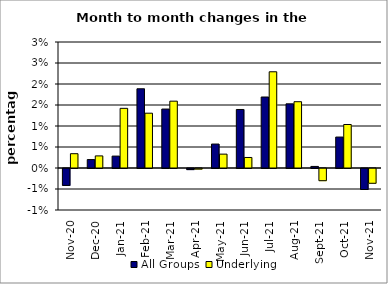
| Category | All Groups | Underlying |
|---|---|---|
| 2020-11-01 | -0.004 | 0.003 |
| 2020-12-01 | 0.002 | 0.003 |
| 2021-01-01 | 0.003 | 0.014 |
| 2021-02-01 | 0.019 | 0.013 |
| 2021-03-01 | 0.014 | 0.016 |
| 2021-04-01 | 0 | 0 |
| 2021-05-01 | 0.006 | 0.003 |
| 2021-06-01 | 0.014 | 0.003 |
| 2021-07-01 | 0.017 | 0.023 |
| 2021-08-01 | 0.015 | 0.016 |
| 2021-09-01 | 0 | -0.003 |
| 2021-10-01 | 0.007 | 0.01 |
| 2021-11-01 | -0.005 | -0.004 |